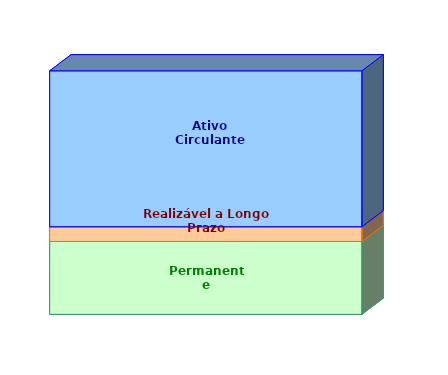
| Category | Permanente | Realizável a Longo Prazo | Ativo Circulante |
|---|---|---|---|
| 0 | 0.299 | 0.061 | 0.64 |